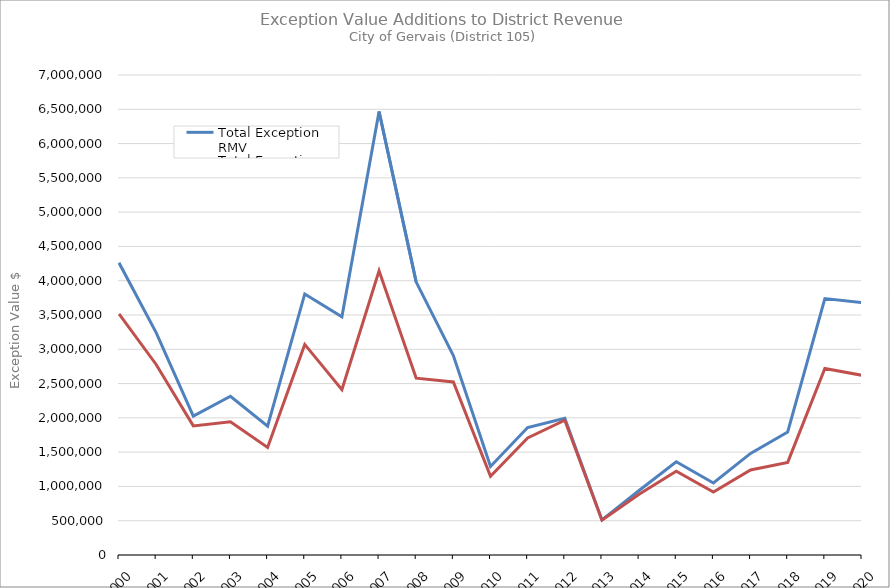
| Category | Total Exception RMV | Total Exception MAV |
|---|---|---|
| 2000.0 | 4260834 | 3516171 |
| 2001.0 | 3243424 | 2778534 |
| 2002.0 | 2025495 | 1882985 |
| 2003.0 | 2315028 | 1943638 |
| 2004.0 | 1878521 | 1569271 |
| 2005.0 | 3806846 | 3071356 |
| 2006.0 | 3473129 | 2411753 |
| 2007.0 | 6467436 | 4144126 |
| 2008.0 | 3979686 | 2579476 |
| 2009.0 | 2907627 | 2524147 |
| 2010.0 | 1291618 | 1147838 |
| 2011.0 | 1858427 | 1706307 |
| 2012.0 | 1992446 | 1964846 |
| 2013.0 | 511844 | 507554 |
| 2014.0 | 940624 | 887404 |
| 2015.0 | 1359483 | 1220863 |
| 2016.0 | 1049709 | 916869 |
| 2017.0 | 1482059 | 1240779 |
| 2018.0 | 1793916 | 1350381 |
| 2019.0 | 3740265 | 2719995 |
| 2020.0 | 3681017 | 2620807 |